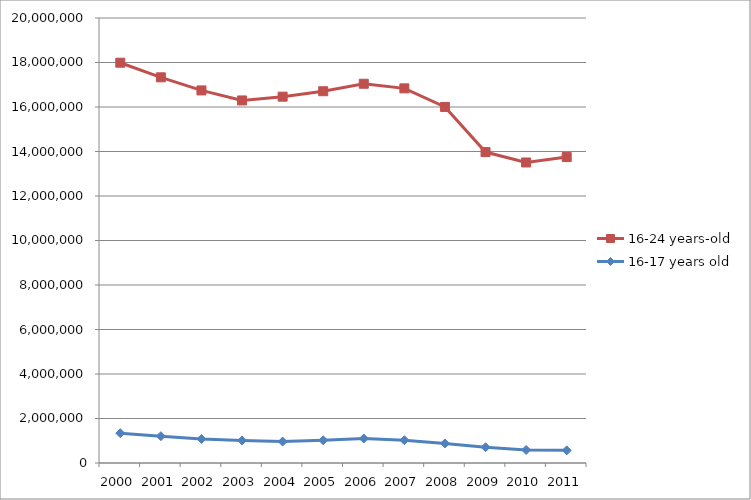
| Category | 16-17 years old | 16-24 years-old |
|---|---|---|
| 2000.0 | 1339652.07 | 16650600.29 |
| 2001.0 | 1205289.75 | 16128315.88 |
| 2002.0 | 1080861.21 | 15664494.4 |
| 2003.0 | 1013417.41 | 15281131.17 |
| 2004.0 | 962786.41 | 15501907.51 |
| 2005.0 | 1020529.27 | 15688382.57 |
| 2006.0 | 1099985.96 | 15944700.51 |
| 2007.0 | 1024801.87 | 15812503.09 |
| 2008.0 | 879431.13 | 15123179.29 |
| 2009.0 | 708522.55 | 13265510.1 |
| 2010.0 | 587390.79 | 12919472.08 |
| 2011.0 | 568545.95 | 13181252.46 |